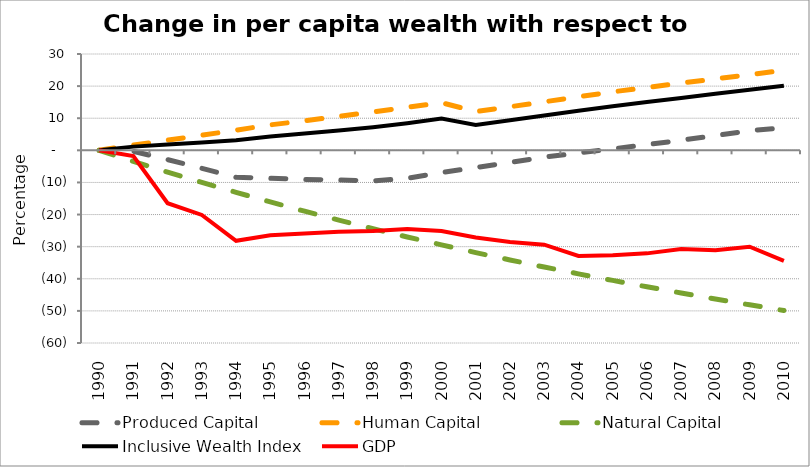
| Category | Produced Capital  | Human Capital | Natural Capital | Inclusive Wealth Index | GDP |
|---|---|---|---|---|---|
| 1990.0 | 0 | 0 | 0 | 0 | 0 |
| 1991.0 | -0.293 | 1.615 | -3.452 | 1.157 | -1.805 |
| 1992.0 | -2.881 | 3.162 | -6.775 | 1.831 | -16.461 |
| 1993.0 | -5.596 | 4.696 | -9.978 | 2.472 | -20.114 |
| 1994.0 | -8.401 | 6.286 | -13.07 | 3.143 | -28.171 |
| 1995.0 | -8.682 | 7.931 | -16.057 | 4.335 | -26.442 |
| 1996.0 | -9.106 | 9.204 | -18.946 | 5.207 | -25.908 |
| 1997.0 | -9.209 | 10.557 | -21.734 | 6.205 | -25.346 |
| 1998.0 | -9.534 | 11.971 | -24.417 | 7.212 | -25.134 |
| 1999.0 | -8.721 | 13.41 | -26.985 | 8.455 | -24.489 |
| 2000.0 | -6.919 | 14.859 | -29.437 | 9.894 | -25.155 |
| 2001.0 | -5.36 | 12.063 | -31.84 | 7.925 | -27.171 |
| 2002.0 | -3.77 | 13.566 | -34.141 | 9.37 | -28.521 |
| 2003.0 | -2.109 | 15.114 | -36.346 | 10.865 | -29.369 |
| 2004.0 | -0.811 | 16.67 | -38.465 | 12.302 | -32.87 |
| 2005.0 | 0.462 | 18.215 | -40.506 | 13.725 | -32.646 |
| 2006.0 | 1.765 | 19.599 | -42.501 | 15.028 | -32.087 |
| 2007.0 | 3.153 | 20.934 | -44.426 | 16.309 | -30.761 |
| 2008.0 | 4.599 | 22.25 | -46.293 | 17.587 | -31.094 |
| 2009.0 | 6.116 | 23.571 | -48.111 | 18.884 | -30.025 |
| 2010.0 | 7.02 | 24.917 | -49.888 | 20.085 | -34.417 |